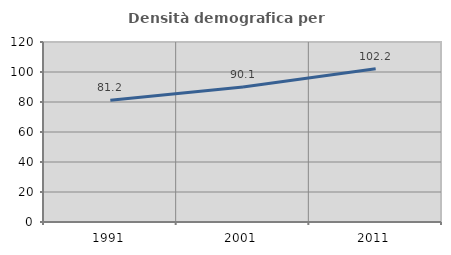
| Category | Densità demografica |
|---|---|
| 1991.0 | 81.211 |
| 2001.0 | 90.054 |
| 2011.0 | 102.228 |